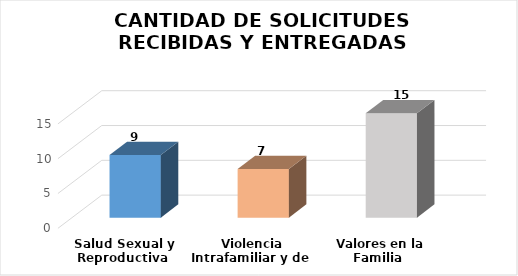
| Category | Series 0 |
|---|---|
|  Salud Sexual y Reproductiva | 9 |
|  Violencia Intrafamiliar y de Género | 7 |
|  Valores en la Familia | 15 |